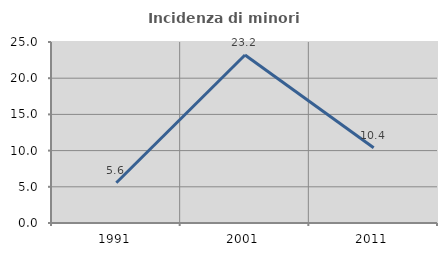
| Category | Incidenza di minori stranieri |
|---|---|
| 1991.0 | 5.556 |
| 2001.0 | 23.2 |
| 2011.0 | 10.394 |